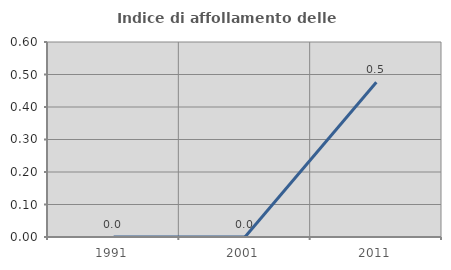
| Category | Indice di affollamento delle abitazioni  |
|---|---|
| 1991.0 | 0 |
| 2001.0 | 0 |
| 2011.0 | 0.476 |